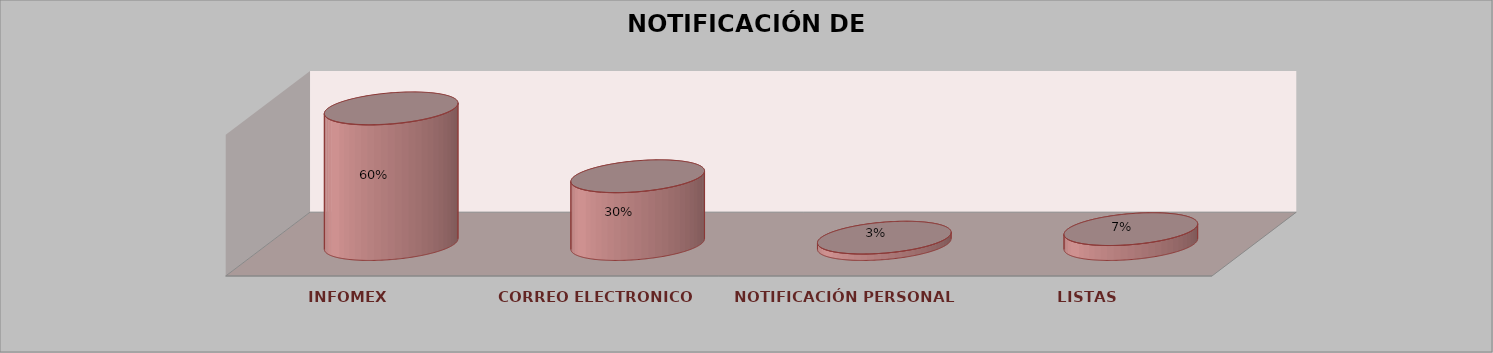
| Category | Series 0 | Series 1 | Series 2 | Series 3 | Series 4 |
|---|---|---|---|---|---|
| INFOMEX |  |  |  | 336 | 0.603 |
| CORREO ELECTRONICO |  |  |  | 168 | 0.302 |
| NOTIFICACIÓN PERSONAL |  |  |  | 16 | 0.029 |
| LISTAS |  |  |  | 37 | 0.066 |